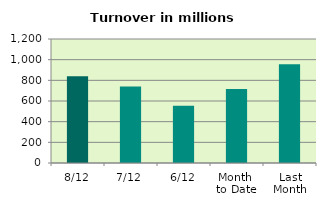
| Category | Series 0 |
|---|---|
| 8/12 | 839.676 |
| 7/12 | 739.482 |
| 6/12 | 553.508 |
| Month 
to Date | 715.716 |
| Last
Month | 954.978 |